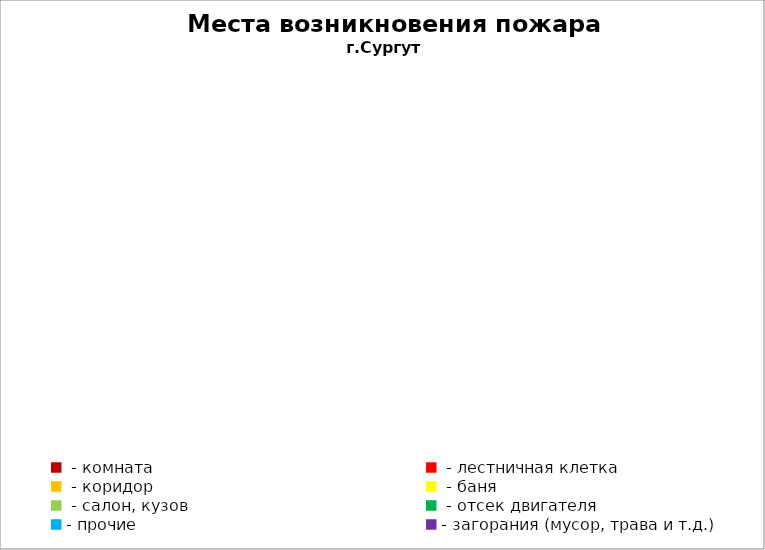
| Category | Места возникновения пожара |
|---|---|
|  - комната | 85 |
|  - лестничная клетка | 39 |
|  - коридор | 5 |
|  - баня | 64 |
|  - салон, кузов | 33 |
|  - отсек двигателя | 33 |
| - прочие | 141 |
| - загорания (мусор, трава и т.д.)  | 197 |